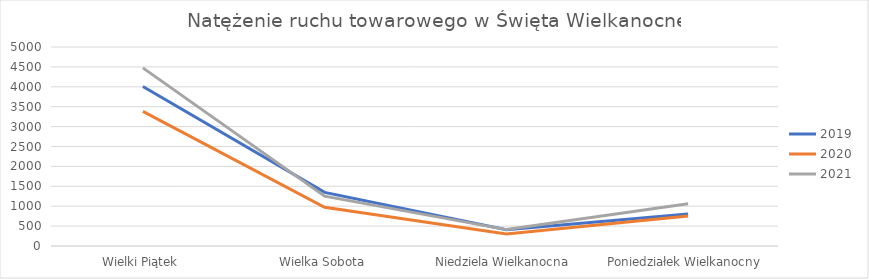
| Category | 2019 | 2020 | 2021 |
|---|---|---|---|
| Wielki Piątek | 4007 | 3384 | 4476 |
| Wielka Sobota | 1347 | 971 | 1253 |
| Niedziela Wielkanocna | 408 | 302 | 412 |
| Poniedziałek Wielkanocny | 805 | 753 | 1059 |